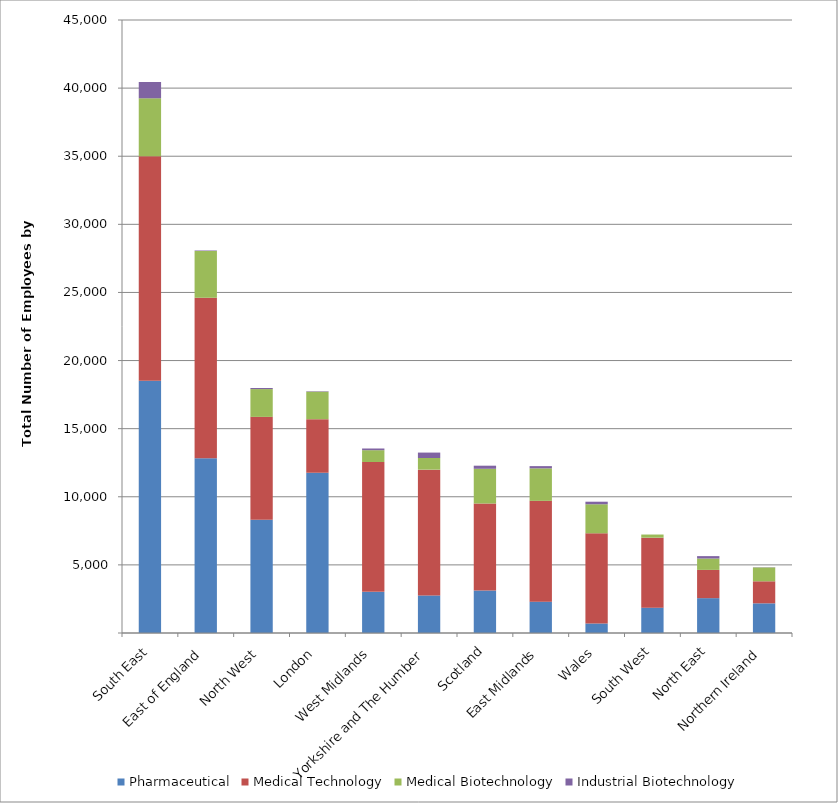
| Category | Pharmaceutical | Medical Technology | Medical Biotechnology | Industrial Biotechnology |
|---|---|---|---|---|
| South East | 18515.85 | 16476.89 | 4260 | 1198 |
| East of England | 12833 | 11784.2 | 3429 | 36 |
| North West | 8314.15 | 7551.59 | 2040 | 80 |
| London | 11766.2 | 3930.95 | 2021 | 31 |
| West Midlands | 3020.6 | 9532.05 | 868 | 124 |
| Yorkshire and The Humber | 2757 | 9234.76 | 854 | 399 |
| Scotland | 3120.3 | 6385.72 | 2549 | 227 |
| East Midlands | 2302.25 | 7399.56 | 2384 | 165 |
| Wales | 699 | 6619.05 | 2132 | 188 |
| South West | 1860.8 | 5136.5 | 231 | 0.9 |
| North East | 2558.85 | 2073.95 | 834 | 177 |
| Northern Ireland | 2178 | 1618 | 1019 | 15 |